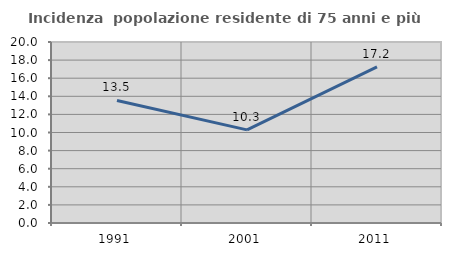
| Category | Incidenza  popolazione residente di 75 anni e più |
|---|---|
| 1991.0 | 13.542 |
| 2001.0 | 10.294 |
| 2011.0 | 17.241 |